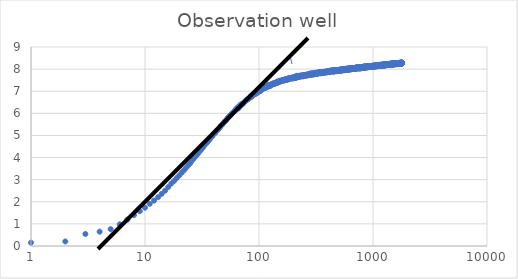
| Category | Series 0 |
|---|---|
| 1.0 | 0.15 |
| 2.0 | 0.205 |
| 3.0 | 0.544 |
| 4.0 | 0.649 |
| 5.0 | 0.763 |
| 6.0 | 0.98 |
| 7.0 | 1.192 |
| 8.0 | 1.401 |
| 9.0 | 1.574 |
| 10.0 | 1.731 |
| 11.0 | 1.908 |
| 12.0 | 2.054 |
| 13.0 | 2.207 |
| 14.0 | 2.358 |
| 15.0 | 2.502 |
| 16.0 | 2.669 |
| 17.0 | 2.823 |
| 18.0 | 2.944 |
| 19.0 | 3.075 |
| 20.0 | 3.197 |
| 21.0 | 3.321 |
| 22.0 | 3.428 |
| 23.0 | 3.543 |
| 24.0 | 3.658 |
| 25.0 | 3.75 |
| 26.0 | 3.877 |
| 27.0 | 3.98 |
| 28.0 | 4.078 |
| 29.0 | 4.163 |
| 30.0 | 4.268 |
| 31.0 | 4.347 |
| 32.0 | 4.434 |
| 33.0 | 4.528 |
| 34.0 | 4.607 |
| 35.0 | 4.68 |
| 36.0 | 4.75 |
| 37.0 | 4.824 |
| 38.0 | 4.922 |
| 39.0 | 4.966 |
| 40.0 | 5.053 |
| 41.0 | 5.105 |
| 42.0 | 5.169 |
| 43.0 | 5.246 |
| 44.0 | 5.278 |
| 45.0 | 5.347 |
| 46.0 | 5.426 |
| 47.0 | 5.462 |
| 48.0 | 5.514 |
| 49.0 | 5.587 |
| 50.0 | 5.626 |
| 51.0 | 5.654 |
| 52.0 | 5.717 |
| 53.0 | 5.781 |
| 54.0 | 5.82 |
| 55.0 | 5.876 |
| 56.0 | 5.91 |
| 57.0 | 5.939 |
| 58.0 | 5.999 |
| 59.0 | 6.03 |
| 60.0 | 6.063 |
| 61.0 | 6.098 |
| 62.0 | 6.131 |
| 63.0 | 6.197 |
| 64.0 | 6.228 |
| 65.0 | 6.268 |
| 66.0 | 6.219 |
| 67.0 | 6.299 |
| 68.0 | 6.367 |
| 69.0 | 6.338 |
| 70.0 | 6.419 |
| 71.0 | 6.415 |
| 72.0 | 6.416 |
| 73.0 | 6.47 |
| 74.0 | 6.504 |
| 75.0 | 6.522 |
| 76.0 | 6.55 |
| 77.0 | 6.593 |
| 78.0 | 6.601 |
| 79.0 | 6.635 |
| 80.0 | 6.647 |
| 81.0 | 6.654 |
| 82.0 | 6.694 |
| 83.0 | 6.714 |
| 84.0 | 6.742 |
| 85.0 | 6.794 |
| 86.0 | 6.743 |
| 87.0 | 6.785 |
| 88.0 | 6.822 |
| 89.0 | 6.875 |
| 90.0 | 6.842 |
| 91.0 | 6.866 |
| 92.0 | 6.878 |
| 93.0 | 6.887 |
| 94.0 | 6.931 |
| 95.0 | 6.896 |
| 96.0 | 6.921 |
| 97.0 | 6.962 |
| 98.0 | 6.984 |
| 99.0 | 7.023 |
| 100.0 | 7.001 |
| 101.0 | 7.03 |
| 102.0 | 6.999 |
| 103.0 | 7.036 |
| 104.0 | 7.036 |
| 105.0 | 7.063 |
| 106.0 | 7.068 |
| 107.0 | 7.1 |
| 108.0 | 7.148 |
| 109.0 | 7.12 |
| 110.0 | 7.13 |
| 111.0 | 7.158 |
| 112.0 | 7.168 |
| 113.0 | 7.187 |
| 114.0 | 7.181 |
| 115.0 | 7.154 |
| 116.0 | 7.188 |
| 117.0 | 7.221 |
| 118.0 | 7.215 |
| 119.0 | 7.219 |
| 120.0 | 7.203 |
| 121.0 | 7.291 |
| 122.0 | 7.244 |
| 123.0 | 7.246 |
| 124.0 | 7.286 |
| 125.0 | 7.272 |
| 126.0 | 7.239 |
| 127.0 | 7.29 |
| 128.0 | 7.308 |
| 129.0 | 7.307 |
| 130.0 | 7.316 |
| 131.0 | 7.303 |
| 132.0 | 7.325 |
| 133.0 | 7.338 |
| 134.0 | 7.33 |
| 135.0 | 7.371 |
| 136.0 | 7.342 |
| 137.0 | 7.344 |
| 138.0 | 7.348 |
| 139.0 | 7.378 |
| 140.0 | 7.367 |
| 141.0 | 7.396 |
| 142.0 | 7.366 |
| 143.0 | 7.418 |
| 144.0 | 7.383 |
| 145.0 | 7.432 |
| 146.0 | 7.387 |
| 147.0 | 7.429 |
| 148.0 | 7.416 |
| 149.0 | 7.428 |
| 150.0 | 7.453 |
| 151.0 | 7.473 |
| 152.0 | 7.444 |
| 153.0 | 7.441 |
| 154.0 | 7.459 |
| 155.0 | 7.459 |
| 156.0 | 7.444 |
| 157.0 | 7.467 |
| 158.0 | 7.495 |
| 159.0 | 7.484 |
| 160.0 | 7.472 |
| 161.0 | 7.486 |
| 162.0 | 7.493 |
| 163.0 | 7.498 |
| 164.0 | 7.503 |
| 165.0 | 7.51 |
| 166.0 | 7.505 |
| 167.0 | 7.485 |
| 168.0 | 7.5 |
| 169.0 | 7.534 |
| 170.0 | 7.539 |
| 171.0 | 7.514 |
| 172.0 | 7.538 |
| 173.0 | 7.538 |
| 174.0 | 7.51 |
| 175.0 | 7.537 |
| 176.0 | 7.551 |
| 177.0 | 7.519 |
| 178.0 | 7.565 |
| 179.0 | 7.545 |
| 180.0 | 7.546 |
| 181.0 | 7.543 |
| 182.0 | 7.586 |
| 183.0 | 7.559 |
| 184.0 | 7.557 |
| 185.0 | 7.573 |
| 186.0 | 7.556 |
| 187.0 | 7.597 |
| 188.0 | 7.593 |
| 189.0 | 7.605 |
| 190.0 | 7.593 |
| 191.0 | 7.589 |
| 192.0 | 7.602 |
| 193.0 | 7.578 |
| 194.0 | 7.598 |
| 195.0 | 7.594 |
| 196.0 | 7.618 |
| 197.0 | 7.596 |
| 198.0 | 7.583 |
| 199.0 | 7.593 |
| 200.0 | 7.586 |
| 201.0 | 7.63 |
| 202.0 | 7.621 |
| 203.0 | 7.595 |
| 204.0 | 7.6 |
| 205.0 | 7.64 |
| 206.0 | 7.658 |
| 207.0 | 7.633 |
| 208.0 | 7.636 |
| 209.0 | 7.643 |
| 210.0 | 7.633 |
| 211.0 | 7.596 |
| 212.0 | 7.666 |
| 213.0 | 7.661 |
| 214.0 | 7.65 |
| 215.0 | 7.698 |
| 216.0 | 7.651 |
| 217.0 | 7.647 |
| 218.0 | 7.643 |
| 219.0 | 7.662 |
| 220.0 | 7.646 |
| 221.0 | 7.683 |
| 222.0 | 7.69 |
| 223.0 | 7.69 |
| 224.0 | 7.658 |
| 225.0 | 7.658 |
| 226.0 | 7.68 |
| 227.0 | 7.654 |
| 228.0 | 7.685 |
| 229.0 | 7.672 |
| 230.0 | 7.691 |
| 231.0 | 7.676 |
| 232.0 | 7.713 |
| 233.0 | 7.677 |
| 234.0 | 7.701 |
| 235.0 | 7.678 |
| 236.0 | 7.684 |
| 237.0 | 7.69 |
| 238.0 | 7.687 |
| 239.0 | 7.706 |
| 240.0 | 7.714 |
| 241.0 | 7.685 |
| 242.0 | 7.67 |
| 243.0 | 7.692 |
| 244.0 | 7.717 |
| 245.0 | 7.684 |
| 246.0 | 7.711 |
| 247.0 | 7.719 |
| 248.0 | 7.7 |
| 249.0 | 7.722 |
| 250.0 | 7.692 |
| 251.0 | 7.722 |
| 252.0 | 7.701 |
| 253.0 | 7.736 |
| 254.0 | 7.736 |
| 255.0 | 7.716 |
| 256.0 | 7.738 |
| 257.0 | 7.716 |
| 258.0 | 7.719 |
| 259.0 | 7.716 |
| 260.0 | 7.728 |
| 261.0 | 7.741 |
| 262.0 | 7.746 |
| 263.0 | 7.723 |
| 264.0 | 7.741 |
| 265.0 | 7.749 |
| 266.0 | 7.714 |
| 267.0 | 7.733 |
| 268.0 | 7.737 |
| 269.0 | 7.741 |
| 270.0 | 7.738 |
| 271.0 | 7.758 |
| 272.0 | 7.772 |
| 273.0 | 7.753 |
| 274.0 | 7.756 |
| 275.0 | 7.765 |
| 276.0 | 7.738 |
| 277.0 | 7.755 |
| 278.0 | 7.736 |
| 279.0 | 7.739 |
| 280.0 | 7.774 |
| 281.0 | 7.772 |
| 282.0 | 7.775 |
| 283.0 | 7.805 |
| 284.0 | 7.784 |
| 285.0 | 7.775 |
| 286.0 | 7.772 |
| 287.0 | 7.754 |
| 288.0 | 7.788 |
| 289.0 | 7.764 |
| 290.0 | 7.782 |
| 291.0 | 7.763 |
| 292.0 | 7.76 |
| 293.0 | 7.772 |
| 294.0 | 7.806 |
| 295.0 | 7.806 |
| 296.0 | 7.78 |
| 297.0 | 7.776 |
| 298.0 | 7.784 |
| 299.0 | 7.794 |
| 300.0 | 7.775 |
| 301.0 | 7.754 |
| 302.0 | 7.798 |
| 303.0 | 7.781 |
| 304.0 | 7.805 |
| 305.0 | 7.773 |
| 306.0 | 7.805 |
| 307.0 | 7.819 |
| 308.0 | 7.781 |
| 309.0 | 7.811 |
| 310.0 | 7.797 |
| 311.0 | 7.821 |
| 312.0 | 7.819 |
| 313.0 | 7.796 |
| 314.0 | 7.81 |
| 315.0 | 7.805 |
| 316.0 | 7.807 |
| 317.0 | 7.816 |
| 318.0 | 7.815 |
| 319.0 | 7.808 |
| 320.0 | 7.838 |
| 321.0 | 7.786 |
| 322.0 | 7.818 |
| 323.0 | 7.837 |
| 324.0 | 7.804 |
| 325.0 | 7.802 |
| 326.0 | 7.827 |
| 327.0 | 7.808 |
| 328.0 | 7.817 |
| 329.0 | 7.826 |
| 330.0 | 7.823 |
| 331.0 | 7.843 |
| 332.0 | 7.804 |
| 333.0 | 7.83 |
| 334.0 | 7.827 |
| 335.0 | 7.819 |
| 336.0 | 7.856 |
| 337.0 | 7.825 |
| 338.0 | 7.832 |
| 339.0 | 7.847 |
| 340.0 | 7.849 |
| 341.0 | 7.831 |
| 342.0 | 7.833 |
| 343.0 | 7.825 |
| 344.0 | 7.843 |
| 345.0 | 7.828 |
| 346.0 | 7.827 |
| 347.0 | 7.863 |
| 348.0 | 7.81 |
| 349.0 | 7.824 |
| 350.0 | 7.857 |
| 351.0 | 7.836 |
| 352.0 | 7.828 |
| 353.0 | 7.847 |
| 354.0 | 7.845 |
| 355.0 | 7.851 |
| 356.0 | 7.847 |
| 357.0 | 7.853 |
| 358.0 | 7.857 |
| 359.0 | 7.843 |
| 360.0 | 7.862 |
| 361.0 | 7.853 |
| 362.0 | 7.837 |
| 363.0 | 7.872 |
| 364.0 | 7.854 |
| 365.0 | 7.828 |
| 366.0 | 7.836 |
| 367.0 | 7.85 |
| 368.0 | 7.855 |
| 369.0 | 7.874 |
| 370.0 | 7.849 |
| 371.0 | 7.876 |
| 372.0 | 7.863 |
| 373.0 | 7.871 |
| 374.0 | 7.85 |
| 375.0 | 7.858 |
| 376.0 | 7.878 |
| 377.0 | 7.864 |
| 378.0 | 7.854 |
| 379.0 | 7.865 |
| 380.0 | 7.865 |
| 381.0 | 7.875 |
| 382.0 | 7.857 |
| 383.0 | 7.877 |
| 384.0 | 7.869 |
| 385.0 | 7.858 |
| 386.0 | 7.86 |
| 387.0 | 7.893 |
| 388.0 | 7.868 |
| 389.0 | 7.879 |
| 390.0 | 7.864 |
| 391.0 | 7.886 |
| 392.0 | 7.873 |
| 393.0 | 7.864 |
| 394.0 | 7.876 |
| 395.0 | 7.859 |
| 396.0 | 7.878 |
| 397.0 | 7.882 |
| 398.0 | 7.859 |
| 399.0 | 7.88 |
| 400.0 | 7.882 |
| 401.0 | 7.881 |
| 402.0 | 7.881 |
| 403.0 | 7.884 |
| 404.0 | 7.89 |
| 405.0 | 7.889 |
| 406.0 | 7.891 |
| 407.0 | 7.894 |
| 408.0 | 7.87 |
| 409.0 | 7.913 |
| 410.0 | 7.896 |
| 411.0 | 7.903 |
| 412.0 | 7.884 |
| 413.0 | 7.893 |
| 414.0 | 7.887 |
| 415.0 | 7.865 |
| 416.0 | 7.883 |
| 417.0 | 7.9 |
| 418.0 | 7.88 |
| 419.0 | 7.892 |
| 420.0 | 7.894 |
| 421.0 | 7.936 |
| 422.0 | 7.899 |
| 423.0 | 7.904 |
| 424.0 | 7.896 |
| 425.0 | 7.898 |
| 426.0 | 7.91 |
| 427.0 | 7.911 |
| 428.0 | 7.907 |
| 429.0 | 7.903 |
| 430.0 | 7.903 |
| 431.0 | 7.915 |
| 432.0 | 7.904 |
| 433.0 | 7.916 |
| 434.0 | 7.928 |
| 435.0 | 7.911 |
| 436.0 | 7.949 |
| 437.0 | 7.904 |
| 438.0 | 7.921 |
| 439.0 | 7.912 |
| 440.0 | 7.911 |
| 441.0 | 7.938 |
| 442.0 | 7.921 |
| 443.0 | 7.918 |
| 444.0 | 7.904 |
| 445.0 | 7.898 |
| 446.0 | 7.923 |
| 447.0 | 7.906 |
| 448.0 | 7.902 |
| 449.0 | 7.913 |
| 450.0 | 7.9 |
| 451.0 | 7.918 |
| 452.0 | 7.909 |
| 453.0 | 7.901 |
| 454.0 | 7.924 |
| 455.0 | 7.897 |
| 456.0 | 7.925 |
| 457.0 | 7.899 |
| 458.0 | 7.925 |
| 459.0 | 7.923 |
| 460.0 | 7.936 |
| 461.0 | 7.948 |
| 462.0 | 7.908 |
| 463.0 | 7.942 |
| 464.0 | 7.907 |
| 465.0 | 7.909 |
| 466.0 | 7.919 |
| 467.0 | 7.926 |
| 468.0 | 7.941 |
| 469.0 | 7.923 |
| 470.0 | 7.94 |
| 471.0 | 7.942 |
| 472.0 | 7.943 |
| 473.0 | 7.943 |
| 474.0 | 7.939 |
| 475.0 | 7.945 |
| 476.0 | 7.908 |
| 477.0 | 7.949 |
| 478.0 | 7.911 |
| 479.0 | 7.923 |
| 480.0 | 7.934 |
| 481.0 | 7.935 |
| 482.0 | 7.939 |
| 483.0 | 7.914 |
| 484.0 | 7.941 |
| 485.0 | 7.948 |
| 486.0 | 7.917 |
| 487.0 | 7.944 |
| 488.0 | 7.939 |
| 489.0 | 7.958 |
| 490.0 | 7.929 |
| 491.0 | 7.915 |
| 492.0 | 7.933 |
| 493.0 | 7.927 |
| 494.0 | 7.943 |
| 495.0 | 7.931 |
| 496.0 | 7.939 |
| 497.0 | 7.925 |
| 498.0 | 7.939 |
| 499.0 | 7.957 |
| 500.0 | 7.95 |
| 501.0 | 7.958 |
| 502.0 | 7.95 |
| 503.0 | 7.967 |
| 504.0 | 7.922 |
| 505.0 | 7.954 |
| 506.0 | 7.963 |
| 507.0 | 7.942 |
| 508.0 | 7.965 |
| 509.0 | 7.958 |
| 510.0 | 7.975 |
| 511.0 | 7.958 |
| 512.0 | 7.951 |
| 513.0 | 7.966 |
| 514.0 | 7.939 |
| 515.0 | 7.967 |
| 516.0 | 7.949 |
| 517.0 | 7.953 |
| 518.0 | 7.958 |
| 519.0 | 7.96 |
| 520.0 | 7.947 |
| 521.0 | 7.97 |
| 522.0 | 7.962 |
| 523.0 | 7.946 |
| 524.0 | 7.956 |
| 525.0 | 7.962 |
| 526.0 | 7.991 |
| 527.0 | 7.961 |
| 528.0 | 7.992 |
| 529.0 | 7.972 |
| 530.0 | 7.936 |
| 531.0 | 7.98 |
| 532.0 | 7.931 |
| 533.0 | 7.965 |
| 534.0 | 7.964 |
| 535.0 | 7.974 |
| 536.0 | 7.969 |
| 537.0 | 7.955 |
| 538.0 | 7.954 |
| 539.0 | 7.948 |
| 540.0 | 7.974 |
| 541.0 | 7.958 |
| 542.0 | 7.981 |
| 543.0 | 7.97 |
| 544.0 | 7.968 |
| 545.0 | 7.96 |
| 546.0 | 7.972 |
| 547.0 | 7.967 |
| 548.0 | 7.973 |
| 549.0 | 7.982 |
| 550.0 | 7.98 |
| 551.0 | 7.984 |
| 552.0 | 7.961 |
| 553.0 | 7.973 |
| 554.0 | 7.962 |
| 555.0 | 7.967 |
| 556.0 | 7.974 |
| 557.0 | 7.948 |
| 558.0 | 7.996 |
| 559.0 | 7.961 |
| 560.0 | 7.966 |
| 561.0 | 7.994 |
| 562.0 | 7.986 |
| 563.0 | 7.985 |
| 564.0 | 7.983 |
| 565.0 | 7.987 |
| 566.0 | 7.959 |
| 567.0 | 7.993 |
| 568.0 | 7.955 |
| 569.0 | 7.98 |
| 570.0 | 7.978 |
| 571.0 | 7.976 |
| 572.0 | 7.999 |
| 573.0 | 7.992 |
| 574.0 | 8.015 |
| 575.0 | 7.956 |
| 576.0 | 7.996 |
| 577.0 | 7.986 |
| 578.0 | 7.977 |
| 579.0 | 7.982 |
| 580.0 | 7.977 |
| 581.0 | 7.983 |
| 582.0 | 8.009 |
| 583.0 | 7.99 |
| 584.0 | 7.979 |
| 585.0 | 8.012 |
| 586.0 | 7.982 |
| 587.0 | 8.014 |
| 588.0 | 7.978 |
| 589.0 | 8.009 |
| 590.0 | 7.997 |
| 591.0 | 7.985 |
| 592.0 | 8.002 |
| 593.0 | 8.002 |
| 594.0 | 7.997 |
| 595.0 | 7.959 |
| 596.0 | 8.008 |
| 597.0 | 7.993 |
| 598.0 | 8.018 |
| 599.0 | 7.994 |
| 600.0 | 8.004 |
| 601.0 | 7.971 |
| 602.0 | 8.001 |
| 603.0 | 7.995 |
| 604.0 | 7.974 |
| 605.0 | 8.004 |
| 606.0 | 8.028 |
| 607.0 | 8.021 |
| 608.0 | 7.984 |
| 609.0 | 8 |
| 610.0 | 7.992 |
| 611.0 | 7.991 |
| 612.0 | 8.011 |
| 613.0 | 8.001 |
| 614.0 | 8.009 |
| 615.0 | 8.001 |
| 616.0 | 8.019 |
| 617.0 | 8 |
| 618.0 | 8.004 |
| 619.0 | 8.019 |
| 620.0 | 8.01 |
| 621.0 | 8.015 |
| 622.0 | 8.016 |
| 623.0 | 7.993 |
| 624.0 | 8.018 |
| 625.0 | 8.022 |
| 626.0 | 8.014 |
| 627.0 | 8.017 |
| 628.0 | 8.029 |
| 629.0 | 8.02 |
| 630.0 | 7.979 |
| 631.0 | 8.008 |
| 632.0 | 7.998 |
| 633.0 | 8.02 |
| 634.0 | 8.037 |
| 635.0 | 7.985 |
| 636.0 | 8.019 |
| 637.0 | 8.026 |
| 638.0 | 8.041 |
| 639.0 | 8.004 |
| 640.0 | 8.012 |
| 641.0 | 8.01 |
| 642.0 | 8.024 |
| 643.0 | 8.013 |
| 644.0 | 8.001 |
| 645.0 | 8.015 |
| 646.0 | 8.011 |
| 647.0 | 8.011 |
| 648.0 | 8.017 |
| 649.0 | 8.013 |
| 650.0 | 8.014 |
| 651.0 | 8.034 |
| 652.0 | 8.019 |
| 653.0 | 8.038 |
| 654.0 | 8.006 |
| 655.0 | 8.013 |
| 656.0 | 8.011 |
| 657.0 | 8.015 |
| 658.0 | 8.029 |
| 659.0 | 8.001 |
| 660.0 | 8.03 |
| 661.0 | 8.024 |
| 662.0 | 8.023 |
| 663.0 | 8.015 |
| 664.0 | 8.055 |
| 665.0 | 8.014 |
| 666.0 | 8.021 |
| 667.0 | 8.019 |
| 668.0 | 8.039 |
| 669.0 | 8.026 |
| 670.0 | 8.01 |
| 671.0 | 8.032 |
| 672.0 | 8.004 |
| 673.0 | 8.019 |
| 674.0 | 8.017 |
| 675.0 | 8.022 |
| 676.0 | 8.041 |
| 677.0 | 8.042 |
| 678.0 | 8.034 |
| 679.0 | 8.029 |
| 680.0 | 8.021 |
| 681.0 | 8.026 |
| 682.0 | 8.014 |
| 683.0 | 8.038 |
| 684.0 | 8.031 |
| 685.0 | 8.027 |
| 686.0 | 8.045 |
| 687.0 | 8.035 |
| 688.0 | 8.028 |
| 689.0 | 8.031 |
| 690.0 | 8.051 |
| 691.0 | 8.021 |
| 692.0 | 8.038 |
| 693.0 | 8.025 |
| 694.0 | 8.035 |
| 695.0 | 8.038 |
| 696.0 | 8.056 |
| 697.0 | 8.05 |
| 698.0 | 8.02 |
| 699.0 | 8.041 |
| 700.0 | 8.003 |
| 701.0 | 8.049 |
| 702.0 | 8.019 |
| 703.0 | 8.044 |
| 704.0 | 8.026 |
| 705.0 | 8.042 |
| 706.0 | 8.053 |
| 707.0 | 8.05 |
| 708.0 | 8.047 |
| 709.0 | 8.046 |
| 710.0 | 8.051 |
| 711.0 | 8.046 |
| 712.0 | 8.051 |
| 713.0 | 8.041 |
| 714.0 | 8.047 |
| 715.0 | 8.056 |
| 716.0 | 8.09 |
| 717.0 | 8.033 |
| 718.0 | 8.069 |
| 719.0 | 8.027 |
| 720.0 | 8.048 |
| 721.0 | 8.04 |
| 722.0 | 8.046 |
| 723.0 | 8.035 |
| 724.0 | 8.067 |
| 725.0 | 8.046 |
| 726.0 | 8.055 |
| 727.0 | 8.053 |
| 728.0 | 8.05 |
| 729.0 | 8.052 |
| 730.0 | 8.046 |
| 731.0 | 8.056 |
| 732.0 | 8.059 |
| 733.0 | 8.071 |
| 734.0 | 8.073 |
| 735.0 | 8.064 |
| 736.0 | 8.047 |
| 737.0 | 8.054 |
| 738.0 | 8.058 |
| 739.0 | 8.054 |
| 740.0 | 8.055 |
| 741.0 | 8.03 |
| 742.0 | 8.05 |
| 743.0 | 8.059 |
| 744.0 | 8.064 |
| 745.0 | 8.045 |
| 746.0 | 8.053 |
| 747.0 | 8.052 |
| 748.0 | 8.066 |
| 749.0 | 8.052 |
| 750.0 | 8.068 |
| 751.0 | 8.056 |
| 752.0 | 8.055 |
| 753.0 | 8.058 |
| 754.0 | 8.074 |
| 755.0 | 8.056 |
| 756.0 | 8.064 |
| 757.0 | 8.057 |
| 758.0 | 8.031 |
| 759.0 | 8.088 |
| 760.0 | 8.068 |
| 761.0 | 8.078 |
| 762.0 | 8.076 |
| 763.0 | 8.064 |
| 764.0 | 8.038 |
| 765.0 | 8.073 |
| 766.0 | 8.058 |
| 767.0 | 8.065 |
| 768.0 | 8.061 |
| 769.0 | 8.069 |
| 770.0 | 8.042 |
| 771.0 | 8.093 |
| 772.0 | 8.063 |
| 773.0 | 8.051 |
| 774.0 | 8.058 |
| 775.0 | 8.029 |
| 776.0 | 8.07 |
| 777.0 | 8.043 |
| 778.0 | 8.061 |
| 779.0 | 8.061 |
| 780.0 | 8.082 |
| 781.0 | 8.067 |
| 782.0 | 8.076 |
| 783.0 | 8.07 |
| 784.0 | 8.069 |
| 785.0 | 8.067 |
| 786.0 | 8.073 |
| 787.0 | 8.08 |
| 788.0 | 8.078 |
| 789.0 | 8.067 |
| 790.0 | 8.061 |
| 791.0 | 8.075 |
| 792.0 | 8.078 |
| 793.0 | 8.058 |
| 794.0 | 8.057 |
| 795.0 | 8.09 |
| 796.0 | 8.055 |
| 797.0 | 8.063 |
| 798.0 | 8.082 |
| 799.0 | 8.072 |
| 800.0 | 8.056 |
| 801.0 | 8.081 |
| 802.0 | 8.063 |
| 803.0 | 8.067 |
| 804.0 | 8.077 |
| 805.0 | 8.074 |
| 806.0 | 8.084 |
| 807.0 | 8.088 |
| 808.0 | 8.069 |
| 809.0 | 8.072 |
| 810.0 | 8.086 |
| 811.0 | 8.073 |
| 812.0 | 8.097 |
| 813.0 | 8.057 |
| 814.0 | 8.09 |
| 815.0 | 8.077 |
| 816.0 | 8.092 |
| 817.0 | 8.059 |
| 818.0 | 8.069 |
| 819.0 | 8.057 |
| 820.0 | 8.087 |
| 821.0 | 8.096 |
| 822.0 | 8.07 |
| 823.0 | 8.1 |
| 824.0 | 8.089 |
| 825.0 | 8.103 |
| 826.0 | 8.093 |
| 827.0 | 8.079 |
| 828.0 | 8.103 |
| 829.0 | 8.089 |
| 830.0 | 8.071 |
| 831.0 | 8.122 |
| 832.0 | 8.077 |
| 833.0 | 8.082 |
| 834.0 | 8.069 |
| 835.0 | 8.086 |
| 836.0 | 8.083 |
| 837.0 | 8.103 |
| 838.0 | 8.067 |
| 839.0 | 8.1 |
| 840.0 | 8.071 |
| 841.0 | 8.099 |
| 842.0 | 8.084 |
| 843.0 | 8.091 |
| 844.0 | 8.079 |
| 845.0 | 8.111 |
| 846.0 | 8.082 |
| 847.0 | 8.087 |
| 848.0 | 8.081 |
| 849.0 | 8.106 |
| 850.0 | 8.09 |
| 851.0 | 8.106 |
| 852.0 | 8.093 |
| 853.0 | 8.104 |
| 854.0 | 8.087 |
| 855.0 | 8.082 |
| 856.0 | 8.092 |
| 857.0 | 8.067 |
| 858.0 | 8.093 |
| 859.0 | 8.102 |
| 860.0 | 8.085 |
| 861.0 | 8.107 |
| 862.0 | 8.117 |
| 863.0 | 8.082 |
| 864.0 | 8.095 |
| 865.0 | 8.103 |
| 866.0 | 8.11 |
| 867.0 | 8.075 |
| 868.0 | 8.107 |
| 869.0 | 8.088 |
| 870.0 | 8.103 |
| 871.0 | 8.103 |
| 872.0 | 8.11 |
| 873.0 | 8.088 |
| 874.0 | 8.085 |
| 875.0 | 8.09 |
| 876.0 | 8.106 |
| 877.0 | 8.101 |
| 878.0 | 8.114 |
| 879.0 | 8.103 |
| 880.0 | 8.095 |
| 881.0 | 8.087 |
| 882.0 | 8.102 |
| 883.0 | 8.088 |
| 884.0 | 8.094 |
| 885.0 | 8.11 |
| 886.0 | 8.109 |
| 887.0 | 8.11 |
| 888.0 | 8.111 |
| 889.0 | 8.126 |
| 890.0 | 8.09 |
| 891.0 | 8.11 |
| 892.0 | 8.099 |
| 893.0 | 8.099 |
| 894.0 | 8.091 |
| 895.0 | 8.108 |
| 896.0 | 8.101 |
| 897.0 | 8.117 |
| 898.0 | 8.109 |
| 899.0 | 8.106 |
| 900.0 | 8.096 |
| 901.0 | 8.123 |
| 902.0 | 8.084 |
| 903.0 | 8.099 |
| 904.0 | 8.088 |
| 905.0 | 8.101 |
| 906.0 | 8.099 |
| 907.0 | 8.116 |
| 908.0 | 8.116 |
| 909.0 | 8.121 |
| 910.0 | 8.107 |
| 911.0 | 8.131 |
| 912.0 | 8.1 |
| 913.0 | 8.094 |
| 914.0 | 8.102 |
| 915.0 | 8.112 |
| 916.0 | 8.135 |
| 917.0 | 8.097 |
| 918.0 | 8.12 |
| 919.0 | 8.096 |
| 920.0 | 8.123 |
| 921.0 | 8.106 |
| 922.0 | 8.116 |
| 923.0 | 8.11 |
| 924.0 | 8.12 |
| 925.0 | 8.1 |
| 926.0 | 8.127 |
| 927.0 | 8.118 |
| 928.0 | 8.106 |
| 929.0 | 8.097 |
| 930.0 | 8.123 |
| 931.0 | 8.101 |
| 932.0 | 8.135 |
| 933.0 | 8.111 |
| 934.0 | 8.137 |
| 935.0 | 8.108 |
| 936.0 | 8.117 |
| 937.0 | 8.122 |
| 938.0 | 8.105 |
| 939.0 | 8.103 |
| 940.0 | 8.098 |
| 941.0 | 8.126 |
| 942.0 | 8.119 |
| 943.0 | 8.114 |
| 944.0 | 8.12 |
| 945.0 | 8.097 |
| 946.0 | 8.122 |
| 947.0 | 8.117 |
| 948.0 | 8.126 |
| 949.0 | 8.115 |
| 950.0 | 8.106 |
| 951.0 | 8.108 |
| 952.0 | 8.101 |
| 953.0 | 8.136 |
| 954.0 | 8.117 |
| 955.0 | 8.118 |
| 956.0 | 8.13 |
| 957.0 | 8.124 |
| 958.0 | 8.103 |
| 959.0 | 8.11 |
| 960.0 | 8.109 |
| 961.0 | 8.136 |
| 962.0 | 8.108 |
| 963.0 | 8.143 |
| 964.0 | 8.099 |
| 965.0 | 8.126 |
| 966.0 | 8.132 |
| 967.0 | 8.11 |
| 968.0 | 8.122 |
| 969.0 | 8.112 |
| 970.0 | 8.105 |
| 971.0 | 8.128 |
| 972.0 | 8.108 |
| 973.0 | 8.113 |
| 974.0 | 8.131 |
| 975.0 | 8.111 |
| 976.0 | 8.139 |
| 977.0 | 8.117 |
| 978.0 | 8.121 |
| 979.0 | 8.132 |
| 980.0 | 8.129 |
| 981.0 | 8.13 |
| 982.0 | 8.138 |
| 983.0 | 8.114 |
| 984.0 | 8.137 |
| 985.0 | 8.135 |
| 986.0 | 8.113 |
| 987.0 | 8.108 |
| 988.0 | 8.148 |
| 989.0 | 8.129 |
| 990.0 | 8.124 |
| 991.0 | 8.121 |
| 992.0 | 8.142 |
| 993.0 | 8.124 |
| 994.0 | 8.144 |
| 995.0 | 8.13 |
| 996.0 | 8.142 |
| 997.0 | 8.127 |
| 998.0 | 8.132 |
| 999.0 | 8.124 |
| 1000.0 | 8.135 |
| 1001.0 | 8.137 |
| 1002.0 | 8.163 |
| 1003.0 | 8.123 |
| 1004.0 | 8.132 |
| 1005.0 | 8.136 |
| 1006.0 | 8.143 |
| 1007.0 | 8.133 |
| 1008.0 | 8.122 |
| 1009.0 | 8.123 |
| 1010.0 | 8.121 |
| 1011.0 | 8.135 |
| 1012.0 | 8.122 |
| 1013.0 | 8.154 |
| 1014.0 | 8.116 |
| 1015.0 | 8.139 |
| 1016.0 | 8.143 |
| 1017.0 | 8.126 |
| 1018.0 | 8.127 |
| 1019.0 | 8.137 |
| 1020.0 | 8.139 |
| 1021.0 | 8.143 |
| 1022.0 | 8.132 |
| 1023.0 | 8.128 |
| 1024.0 | 8.141 |
| 1025.0 | 8.143 |
| 1026.0 | 8.138 |
| 1027.0 | 8.14 |
| 1028.0 | 8.137 |
| 1029.0 | 8.136 |
| 1030.0 | 8.152 |
| 1031.0 | 8.138 |
| 1032.0 | 8.135 |
| 1033.0 | 8.153 |
| 1034.0 | 8.148 |
| 1035.0 | 8.143 |
| 1036.0 | 8.123 |
| 1037.0 | 8.167 |
| 1038.0 | 8.148 |
| 1039.0 | 8.14 |
| 1040.0 | 8.154 |
| 1041.0 | 8.138 |
| 1042.0 | 8.129 |
| 1043.0 | 8.156 |
| 1044.0 | 8.138 |
| 1045.0 | 8.14 |
| 1046.0 | 8.144 |
| 1047.0 | 8.128 |
| 1048.0 | 8.127 |
| 1049.0 | 8.171 |
| 1050.0 | 8.151 |
| 1051.0 | 8.149 |
| 1052.0 | 8.153 |
| 1053.0 | 8.136 |
| 1054.0 | 8.153 |
| 1055.0 | 8.137 |
| 1056.0 | 8.149 |
| 1057.0 | 8.159 |
| 1058.0 | 8.139 |
| 1059.0 | 8.14 |
| 1060.0 | 8.15 |
| 1061.0 | 8.136 |
| 1062.0 | 8.133 |
| 1063.0 | 8.134 |
| 1064.0 | 8.148 |
| 1065.0 | 8.15 |
| 1066.0 | 8.135 |
| 1067.0 | 8.122 |
| 1068.0 | 8.167 |
| 1069.0 | 8.137 |
| 1070.0 | 8.148 |
| 1071.0 | 8.149 |
| 1072.0 | 8.16 |
| 1073.0 | 8.141 |
| 1074.0 | 8.164 |
| 1075.0 | 8.149 |
| 1076.0 | 8.165 |
| 1077.0 | 8.132 |
| 1078.0 | 8.173 |
| 1079.0 | 8.153 |
| 1080.0 | 8.17 |
| 1081.0 | 8.151 |
| 1082.0 | 8.148 |
| 1083.0 | 8.147 |
| 1084.0 | 8.177 |
| 1085.0 | 8.145 |
| 1086.0 | 8.156 |
| 1087.0 | 8.166 |
| 1088.0 | 8.148 |
| 1089.0 | 8.137 |
| 1090.0 | 8.137 |
| 1091.0 | 8.177 |
| 1092.0 | 8.147 |
| 1093.0 | 8.166 |
| 1094.0 | 8.154 |
| 1095.0 | 8.15 |
| 1096.0 | 8.156 |
| 1097.0 | 8.156 |
| 1098.0 | 8.154 |
| 1099.0 | 8.181 |
| 1100.0 | 8.154 |
| 1101.0 | 8.156 |
| 1102.0 | 8.171 |
| 1103.0 | 8.15 |
| 1104.0 | 8.146 |
| 1105.0 | 8.152 |
| 1106.0 | 8.137 |
| 1107.0 | 8.157 |
| 1108.0 | 8.176 |
| 1109.0 | 8.168 |
| 1110.0 | 8.163 |
| 1111.0 | 8.152 |
| 1112.0 | 8.169 |
| 1113.0 | 8.176 |
| 1114.0 | 8.18 |
| 1115.0 | 8.164 |
| 1116.0 | 8.154 |
| 1117.0 | 8.151 |
| 1118.0 | 8.149 |
| 1119.0 | 8.156 |
| 1120.0 | 8.145 |
| 1121.0 | 8.155 |
| 1122.0 | 8.156 |
| 1123.0 | 8.155 |
| 1124.0 | 8.136 |
| 1125.0 | 8.177 |
| 1126.0 | 8.172 |
| 1127.0 | 8.186 |
| 1128.0 | 8.161 |
| 1129.0 | 8.149 |
| 1130.0 | 8.169 |
| 1131.0 | 8.147 |
| 1132.0 | 8.179 |
| 1133.0 | 8.166 |
| 1134.0 | 8.186 |
| 1135.0 | 8.158 |
| 1136.0 | 8.18 |
| 1137.0 | 8.174 |
| 1138.0 | 8.174 |
| 1139.0 | 8.164 |
| 1140.0 | 8.161 |
| 1141.0 | 8.166 |
| 1142.0 | 8.167 |
| 1143.0 | 8.155 |
| 1144.0 | 8.188 |
| 1145.0 | 8.155 |
| 1146.0 | 8.178 |
| 1147.0 | 8.175 |
| 1148.0 | 8.152 |
| 1149.0 | 8.158 |
| 1150.0 | 8.166 |
| 1151.0 | 8.167 |
| 1152.0 | 8.163 |
| 1153.0 | 8.173 |
| 1154.0 | 8.162 |
| 1155.0 | 8.159 |
| 1156.0 | 8.197 |
| 1157.0 | 8.161 |
| 1158.0 | 8.177 |
| 1159.0 | 8.157 |
| 1160.0 | 8.186 |
| 1161.0 | 8.162 |
| 1162.0 | 8.18 |
| 1163.0 | 8.179 |
| 1164.0 | 8.146 |
| 1165.0 | 8.183 |
| 1166.0 | 8.154 |
| 1167.0 | 8.19 |
| 1168.0 | 8.174 |
| 1169.0 | 8.173 |
| 1170.0 | 8.168 |
| 1171.0 | 8.183 |
| 1172.0 | 8.165 |
| 1173.0 | 8.166 |
| 1174.0 | 8.154 |
| 1175.0 | 8.182 |
| 1176.0 | 8.166 |
| 1177.0 | 8.174 |
| 1178.0 | 8.189 |
| 1179.0 | 8.189 |
| 1180.0 | 8.158 |
| 1181.0 | 8.174 |
| 1182.0 | 8.17 |
| 1183.0 | 8.178 |
| 1184.0 | 8.187 |
| 1185.0 | 8.195 |
| 1186.0 | 8.164 |
| 1187.0 | 8.159 |
| 1188.0 | 8.165 |
| 1189.0 | 8.175 |
| 1190.0 | 8.166 |
| 1191.0 | 8.189 |
| 1192.0 | 8.191 |
| 1193.0 | 8.183 |
| 1194.0 | 8.189 |
| 1195.0 | 8.171 |
| 1196.0 | 8.195 |
| 1197.0 | 8.169 |
| 1198.0 | 8.188 |
| 1199.0 | 8.16 |
| 1200.0 | 8.173 |
| 1201.0 | 8.167 |
| 1202.0 | 8.17 |
| 1203.0 | 8.188 |
| 1204.0 | 8.186 |
| 1205.0 | 8.199 |
| 1206.0 | 8.179 |
| 1207.0 | 8.176 |
| 1208.0 | 8.192 |
| 1209.0 | 8.196 |
| 1210.0 | 8.188 |
| 1211.0 | 8.177 |
| 1212.0 | 8.195 |
| 1213.0 | 8.191 |
| 1214.0 | 8.178 |
| 1215.0 | 8.174 |
| 1216.0 | 8.175 |
| 1217.0 | 8.197 |
| 1218.0 | 8.184 |
| 1219.0 | 8.184 |
| 1220.0 | 8.171 |
| 1221.0 | 8.2 |
| 1222.0 | 8.167 |
| 1223.0 | 8.194 |
| 1224.0 | 8.174 |
| 1225.0 | 8.183 |
| 1226.0 | 8.174 |
| 1227.0 | 8.192 |
| 1228.0 | 8.193 |
| 1229.0 | 8.18 |
| 1230.0 | 8.194 |
| 1231.0 | 8.198 |
| 1232.0 | 8.173 |
| 1233.0 | 8.192 |
| 1234.0 | 8.204 |
| 1235.0 | 8.183 |
| 1236.0 | 8.171 |
| 1237.0 | 8.202 |
| 1238.0 | 8.2 |
| 1239.0 | 8.192 |
| 1240.0 | 8.188 |
| 1241.0 | 8.198 |
| 1242.0 | 8.19 |
| 1243.0 | 8.162 |
| 1244.0 | 8.198 |
| 1245.0 | 8.174 |
| 1246.0 | 8.182 |
| 1247.0 | 8.192 |
| 1248.0 | 8.192 |
| 1249.0 | 8.185 |
| 1250.0 | 8.192 |
| 1251.0 | 8.195 |
| 1252.0 | 8.191 |
| 1253.0 | 8.181 |
| 1254.0 | 8.186 |
| 1255.0 | 8.189 |
| 1256.0 | 8.178 |
| 1257.0 | 8.202 |
| 1258.0 | 8.196 |
| 1259.0 | 8.179 |
| 1260.0 | 8.2 |
| 1261.0 | 8.199 |
| 1262.0 | 8.211 |
| 1263.0 | 8.176 |
| 1264.0 | 8.189 |
| 1265.0 | 8.178 |
| 1266.0 | 8.209 |
| 1267.0 | 8.186 |
| 1268.0 | 8.196 |
| 1269.0 | 8.174 |
| 1270.0 | 8.206 |
| 1271.0 | 8.176 |
| 1272.0 | 8.208 |
| 1273.0 | 8.196 |
| 1274.0 | 8.196 |
| 1275.0 | 8.177 |
| 1276.0 | 8.21 |
| 1277.0 | 8.173 |
| 1278.0 | 8.188 |
| 1279.0 | 8.173 |
| 1280.0 | 8.207 |
| 1281.0 | 8.18 |
| 1282.0 | 8.201 |
| 1283.0 | 8.19 |
| 1284.0 | 8.198 |
| 1285.0 | 8.193 |
| 1286.0 | 8.201 |
| 1287.0 | 8.202 |
| 1288.0 | 8.197 |
| 1289.0 | 8.204 |
| 1290.0 | 8.205 |
| 1291.0 | 8.169 |
| 1292.0 | 8.203 |
| 1293.0 | 8.212 |
| 1294.0 | 8.203 |
| 1295.0 | 8.199 |
| 1296.0 | 8.19 |
| 1297.0 | 8.204 |
| 1298.0 | 8.203 |
| 1299.0 | 8.197 |
| 1300.0 | 8.211 |
| 1301.0 | 8.207 |
| 1302.0 | 8.204 |
| 1303.0 | 8.216 |
| 1304.0 | 8.196 |
| 1305.0 | 8.212 |
| 1306.0 | 8.197 |
| 1307.0 | 8.199 |
| 1308.0 | 8.199 |
| 1309.0 | 8.209 |
| 1310.0 | 8.217 |
| 1311.0 | 8.194 |
| 1312.0 | 8.202 |
| 1313.0 | 8.191 |
| 1314.0 | 8.19 |
| 1315.0 | 8.206 |
| 1316.0 | 8.19 |
| 1317.0 | 8.195 |
| 1318.0 | 8.19 |
| 1319.0 | 8.19 |
| 1320.0 | 8.185 |
| 1321.0 | 8.212 |
| 1322.0 | 8.185 |
| 1323.0 | 8.198 |
| 1324.0 | 8.197 |
| 1325.0 | 8.221 |
| 1326.0 | 8.193 |
| 1327.0 | 8.199 |
| 1328.0 | 8.187 |
| 1329.0 | 8.195 |
| 1330.0 | 8.196 |
| 1331.0 | 8.205 |
| 1332.0 | 8.182 |
| 1333.0 | 8.222 |
| 1334.0 | 8.2 |
| 1335.0 | 8.21 |
| 1336.0 | 8.191 |
| 1337.0 | 8.212 |
| 1338.0 | 8.189 |
| 1339.0 | 8.2 |
| 1340.0 | 8.214 |
| 1341.0 | 8.2 |
| 1342.0 | 8.205 |
| 1343.0 | 8.21 |
| 1344.0 | 8.2 |
| 1345.0 | 8.203 |
| 1346.0 | 8.21 |
| 1347.0 | 8.21 |
| 1348.0 | 8.216 |
| 1349.0 | 8.203 |
| 1350.0 | 8.193 |
| 1351.0 | 8.217 |
| 1352.0 | 8.187 |
| 1353.0 | 8.226 |
| 1354.0 | 8.204 |
| 1355.0 | 8.204 |
| 1356.0 | 8.197 |
| 1357.0 | 8.216 |
| 1358.0 | 8.208 |
| 1359.0 | 8.204 |
| 1360.0 | 8.21 |
| 1361.0 | 8.216 |
| 1362.0 | 8.206 |
| 1363.0 | 8.232 |
| 1364.0 | 8.203 |
| 1365.0 | 8.202 |
| 1366.0 | 8.198 |
| 1367.0 | 8.2 |
| 1368.0 | 8.214 |
| 1369.0 | 8.205 |
| 1370.0 | 8.219 |
| 1371.0 | 8.202 |
| 1372.0 | 8.209 |
| 1373.0 | 8.207 |
| 1374.0 | 8.206 |
| 1375.0 | 8.208 |
| 1376.0 | 8.218 |
| 1377.0 | 8.209 |
| 1378.0 | 8.201 |
| 1379.0 | 8.207 |
| 1380.0 | 8.207 |
| 1381.0 | 8.205 |
| 1382.0 | 8.214 |
| 1383.0 | 8.23 |
| 1384.0 | 8.21 |
| 1385.0 | 8.214 |
| 1386.0 | 8.221 |
| 1387.0 | 8.197 |
| 1388.0 | 8.218 |
| 1389.0 | 8.227 |
| 1390.0 | 8.225 |
| 1391.0 | 8.213 |
| 1392.0 | 8.21 |
| 1393.0 | 8.222 |
| 1394.0 | 8.207 |
| 1395.0 | 8.202 |
| 1396.0 | 8.211 |
| 1397.0 | 8.204 |
| 1398.0 | 8.21 |
| 1399.0 | 8.233 |
| 1400.0 | 8.227 |
| 1401.0 | 8.193 |
| 1402.0 | 8.217 |
| 1403.0 | 8.209 |
| 1404.0 | 8.24 |
| 1405.0 | 8.219 |
| 1406.0 | 8.225 |
| 1407.0 | 8.241 |
| 1408.0 | 8.204 |
| 1409.0 | 8.213 |
| 1410.0 | 8.227 |
| 1411.0 | 8.22 |
| 1412.0 | 8.201 |
| 1413.0 | 8.225 |
| 1414.0 | 8.232 |
| 1415.0 | 8.212 |
| 1416.0 | 8.237 |
| 1417.0 | 8.207 |
| 1418.0 | 8.22 |
| 1419.0 | 8.219 |
| 1420.0 | 8.233 |
| 1421.0 | 8.221 |
| 1422.0 | 8.236 |
| 1423.0 | 8.231 |
| 1424.0 | 8.211 |
| 1425.0 | 8.233 |
| 1426.0 | 8.238 |
| 1427.0 | 8.217 |
| 1428.0 | 8.226 |
| 1429.0 | 8.231 |
| 1430.0 | 8.215 |
| 1431.0 | 8.223 |
| 1432.0 | 8.233 |
| 1433.0 | 8.227 |
| 1434.0 | 8.225 |
| 1435.0 | 8.23 |
| 1436.0 | 8.234 |
| 1437.0 | 8.234 |
| 1438.0 | 8.212 |
| 1439.0 | 8.242 |
| 1440.0 | 8.234 |
| 1441.0 | 8.227 |
| 1442.0 | 8.221 |
| 1443.0 | 8.24 |
| 1444.0 | 8.21 |
| 1445.0 | 8.224 |
| 1446.0 | 8.218 |
| 1447.0 | 8.221 |
| 1448.0 | 8.236 |
| 1449.0 | 8.224 |
| 1450.0 | 8.216 |
| 1451.0 | 8.23 |
| 1452.0 | 8.226 |
| 1453.0 | 8.224 |
| 1454.0 | 8.235 |
| 1455.0 | 8.241 |
| 1456.0 | 8.229 |
| 1457.0 | 8.231 |
| 1458.0 | 8.234 |
| 1459.0 | 8.224 |
| 1460.0 | 8.225 |
| 1461.0 | 8.217 |
| 1462.0 | 8.24 |
| 1463.0 | 8.248 |
| 1464.0 | 8.234 |
| 1465.0 | 8.223 |
| 1466.0 | 8.222 |
| 1467.0 | 8.229 |
| 1468.0 | 8.221 |
| 1469.0 | 8.229 |
| 1470.0 | 8.239 |
| 1471.0 | 8.225 |
| 1472.0 | 8.229 |
| 1473.0 | 8.232 |
| 1474.0 | 8.224 |
| 1475.0 | 8.203 |
| 1476.0 | 8.24 |
| 1477.0 | 8.222 |
| 1478.0 | 8.236 |
| 1479.0 | 8.221 |
| 1480.0 | 8.232 |
| 1481.0 | 8.218 |
| 1482.0 | 8.229 |
| 1483.0 | 8.212 |
| 1484.0 | 8.244 |
| 1485.0 | 8.229 |
| 1486.0 | 8.234 |
| 1487.0 | 8.217 |
| 1488.0 | 8.228 |
| 1489.0 | 8.201 |
| 1490.0 | 8.245 |
| 1491.0 | 8.238 |
| 1492.0 | 8.233 |
| 1493.0 | 8.251 |
| 1494.0 | 8.247 |
| 1495.0 | 8.24 |
| 1496.0 | 8.233 |
| 1497.0 | 8.236 |
| 1498.0 | 8.229 |
| 1499.0 | 8.239 |
| 1500.0 | 8.228 |
| 1501.0 | 8.237 |
| 1502.0 | 8.22 |
| 1503.0 | 8.247 |
| 1504.0 | 8.241 |
| 1505.0 | 8.237 |
| 1506.0 | 8.24 |
| 1507.0 | 8.246 |
| 1508.0 | 8.222 |
| 1509.0 | 8.24 |
| 1510.0 | 8.22 |
| 1511.0 | 8.248 |
| 1512.0 | 8.22 |
| 1513.0 | 8.222 |
| 1514.0 | 8.244 |
| 1515.0 | 8.256 |
| 1516.0 | 8.229 |
| 1517.0 | 8.242 |
| 1518.0 | 8.24 |
| 1519.0 | 8.236 |
| 1520.0 | 8.236 |
| 1521.0 | 8.259 |
| 1522.0 | 8.228 |
| 1523.0 | 8.24 |
| 1524.0 | 8.24 |
| 1525.0 | 8.245 |
| 1526.0 | 8.223 |
| 1527.0 | 8.249 |
| 1528.0 | 8.267 |
| 1529.0 | 8.25 |
| 1530.0 | 8.227 |
| 1531.0 | 8.246 |
| 1532.0 | 8.237 |
| 1533.0 | 8.246 |
| 1534.0 | 8.247 |
| 1535.0 | 8.24 |
| 1536.0 | 8.241 |
| 1537.0 | 8.247 |
| 1538.0 | 8.237 |
| 1539.0 | 8.219 |
| 1540.0 | 8.254 |
| 1541.0 | 8.244 |
| 1542.0 | 8.249 |
| 1543.0 | 8.235 |
| 1544.0 | 8.259 |
| 1545.0 | 8.236 |
| 1546.0 | 8.249 |
| 1547.0 | 8.238 |
| 1548.0 | 8.255 |
| 1549.0 | 8.214 |
| 1550.0 | 8.253 |
| 1551.0 | 8.218 |
| 1552.0 | 8.274 |
| 1553.0 | 8.235 |
| 1554.0 | 8.255 |
| 1555.0 | 8.237 |
| 1556.0 | 8.259 |
| 1557.0 | 8.239 |
| 1558.0 | 8.246 |
| 1559.0 | 8.248 |
| 1560.0 | 8.243 |
| 1561.0 | 8.237 |
| 1562.0 | 8.262 |
| 1563.0 | 8.227 |
| 1564.0 | 8.248 |
| 1565.0 | 8.226 |
| 1566.0 | 8.248 |
| 1567.0 | 8.236 |
| 1568.0 | 8.249 |
| 1569.0 | 8.252 |
| 1570.0 | 8.239 |
| 1571.0 | 8.243 |
| 1572.0 | 8.249 |
| 1573.0 | 8.254 |
| 1574.0 | 8.259 |
| 1575.0 | 8.243 |
| 1576.0 | 8.259 |
| 1577.0 | 8.256 |
| 1578.0 | 8.252 |
| 1579.0 | 8.248 |
| 1580.0 | 8.24 |
| 1581.0 | 8.254 |
| 1582.0 | 8.238 |
| 1583.0 | 8.238 |
| 1584.0 | 8.243 |
| 1585.0 | 8.249 |
| 1586.0 | 8.247 |
| 1587.0 | 8.25 |
| 1588.0 | 8.247 |
| 1589.0 | 8.255 |
| 1590.0 | 8.254 |
| 1591.0 | 8.252 |
| 1592.0 | 8.24 |
| 1593.0 | 8.253 |
| 1594.0 | 8.232 |
| 1595.0 | 8.255 |
| 1596.0 | 8.24 |
| 1597.0 | 8.255 |
| 1598.0 | 8.232 |
| 1599.0 | 8.268 |
| 1600.0 | 8.249 |
| 1601.0 | 8.263 |
| 1602.0 | 8.237 |
| 1603.0 | 8.249 |
| 1604.0 | 8.249 |
| 1605.0 | 8.262 |
| 1606.0 | 8.265 |
| 1607.0 | 8.256 |
| 1608.0 | 8.246 |
| 1609.0 | 8.244 |
| 1610.0 | 8.221 |
| 1611.0 | 8.252 |
| 1612.0 | 8.242 |
| 1613.0 | 8.268 |
| 1614.0 | 8.246 |
| 1615.0 | 8.252 |
| 1616.0 | 8.251 |
| 1617.0 | 8.245 |
| 1618.0 | 8.233 |
| 1619.0 | 8.278 |
| 1620.0 | 8.23 |
| 1621.0 | 8.257 |
| 1622.0 | 8.239 |
| 1623.0 | 8.248 |
| 1624.0 | 8.241 |
| 1625.0 | 8.254 |
| 1626.0 | 8.238 |
| 1627.0 | 8.253 |
| 1628.0 | 8.243 |
| 1629.0 | 8.256 |
| 1630.0 | 8.246 |
| 1631.0 | 8.259 |
| 1632.0 | 8.241 |
| 1633.0 | 8.251 |
| 1634.0 | 8.259 |
| 1635.0 | 8.255 |
| 1636.0 | 8.252 |
| 1637.0 | 8.261 |
| 1638.0 | 8.254 |
| 1639.0 | 8.268 |
| 1640.0 | 8.248 |
| 1641.0 | 8.261 |
| 1642.0 | 8.243 |
| 1643.0 | 8.266 |
| 1644.0 | 8.26 |
| 1645.0 | 8.25 |
| 1646.0 | 8.247 |
| 1647.0 | 8.248 |
| 1648.0 | 8.266 |
| 1649.0 | 8.258 |
| 1650.0 | 8.26 |
| 1651.0 | 8.262 |
| 1652.0 | 8.261 |
| 1653.0 | 8.268 |
| 1654.0 | 8.255 |
| 1655.0 | 8.252 |
| 1656.0 | 8.239 |
| 1657.0 | 8.247 |
| 1658.0 | 8.267 |
| 1659.0 | 8.273 |
| 1660.0 | 8.246 |
| 1661.0 | 8.255 |
| 1662.0 | 8.265 |
| 1663.0 | 8.259 |
| 1664.0 | 8.245 |
| 1665.0 | 8.278 |
| 1666.0 | 8.234 |
| 1667.0 | 8.278 |
| 1668.0 | 8.242 |
| 1669.0 | 8.259 |
| 1670.0 | 8.27 |
| 1671.0 | 8.269 |
| 1672.0 | 8.25 |
| 1673.0 | 8.26 |
| 1674.0 | 8.247 |
| 1675.0 | 8.257 |
| 1676.0 | 8.256 |
| 1677.0 | 8.263 |
| 1678.0 | 8.258 |
| 1679.0 | 8.261 |
| 1680.0 | 8.267 |
| 1681.0 | 8.271 |
| 1682.0 | 8.242 |
| 1683.0 | 8.268 |
| 1684.0 | 8.25 |
| 1685.0 | 8.26 |
| 1686.0 | 8.251 |
| 1687.0 | 8.257 |
| 1688.0 | 8.243 |
| 1689.0 | 8.241 |
| 1690.0 | 8.255 |
| 1691.0 | 8.258 |
| 1692.0 | 8.249 |
| 1693.0 | 8.26 |
| 1694.0 | 8.237 |
| 1695.0 | 8.26 |
| 1696.0 | 8.249 |
| 1697.0 | 8.253 |
| 1698.0 | 8.272 |
| 1699.0 | 8.26 |
| 1700.0 | 8.269 |
| 1701.0 | 8.257 |
| 1702.0 | 8.252 |
| 1703.0 | 8.259 |
| 1704.0 | 8.261 |
| 1705.0 | 8.279 |
| 1706.0 | 8.247 |
| 1707.0 | 8.267 |
| 1708.0 | 8.246 |
| 1709.0 | 8.267 |
| 1710.0 | 8.25 |
| 1711.0 | 8.266 |
| 1712.0 | 8.271 |
| 1713.0 | 8.268 |
| 1714.0 | 8.257 |
| 1715.0 | 8.257 |
| 1716.0 | 8.253 |
| 1717.0 | 8.279 |
| 1718.0 | 8.247 |
| 1719.0 | 8.263 |
| 1720.0 | 8.26 |
| 1721.0 | 8.263 |
| 1722.0 | 8.246 |
| 1723.0 | 8.292 |
| 1724.0 | 8.247 |
| 1725.0 | 8.285 |
| 1726.0 | 8.271 |
| 1727.0 | 8.269 |
| 1728.0 | 8.255 |
| 1729.0 | 8.272 |
| 1730.0 | 8.238 |
| 1731.0 | 8.251 |
| 1732.0 | 8.261 |
| 1733.0 | 8.261 |
| 1734.0 | 8.262 |
| 1735.0 | 8.273 |
| 1736.0 | 8.239 |
| 1737.0 | 8.263 |
| 1738.0 | 8.254 |
| 1739.0 | 8.28 |
| 1740.0 | 8.248 |
| 1741.0 | 8.28 |
| 1742.0 | 8.259 |
| 1743.0 | 8.275 |
| 1744.0 | 8.254 |
| 1745.0 | 8.273 |
| 1746.0 | 8.265 |
| 1747.0 | 8.285 |
| 1748.0 | 8.261 |
| 1749.0 | 8.266 |
| 1750.0 | 8.25 |
| 1751.0 | 8.268 |
| 1752.0 | 8.25 |
| 1753.0 | 8.279 |
| 1754.0 | 8.27 |
| 1755.0 | 8.275 |
| 1756.0 | 8.255 |
| 1757.0 | 8.272 |
| 1758.0 | 8.282 |
| 1759.0 | 8.28 |
| 1760.0 | 8.261 |
| 1761.0 | 8.294 |
| 1762.0 | 8.271 |
| 1763.0 | 8.274 |
| 1764.0 | 8.261 |
| 1765.0 | 8.292 |
| 1766.0 | 8.261 |
| 1767.0 | 8.278 |
| 1768.0 | 8.277 |
| 1769.0 | 8.275 |
| 1770.0 | 8.26 |
| 1771.0 | 8.276 |
| 1772.0 | 8.268 |
| 1773.0 | 8.296 |
| 1774.0 | 8.278 |
| 1775.0 | 8.278 |
| 1776.0 | 8.267 |
| 1777.0 | 8.266 |
| 1778.0 | 8.271 |
| 1779.0 | 8.275 |
| 1780.0 | 8.259 |
| 1781.0 | 8.267 |
| 1782.0 | 8.266 |
| 1783.0 | 8.275 |
| 1784.0 | 8.269 |
| 1785.0 | 8.286 |
| 1786.0 | 8.265 |
| 1787.0 | 8.292 |
| 1788.0 | 8.279 |
| 1789.0 | 8.278 |
| 1790.0 | 8.26 |
| 1791.0 | 8.282 |
| 1792.0 | 8.252 |
| 1793.0 | 8.29 |
| 1794.0 | 8.272 |
| 1795.0 | 8.285 |
| 1796.0 | 8.257 |
| 1797.0 | 8.286 |
| 1798.0 | 8.266 |
| 1799.0 | 8.276 |
| 1800.0 | 8.287 |